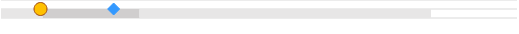
| Category | left | mid start | mid end | right |
|---|---|---|---|---|
| 0 | 0 | 0.097 | 0.225 | 0.678 |